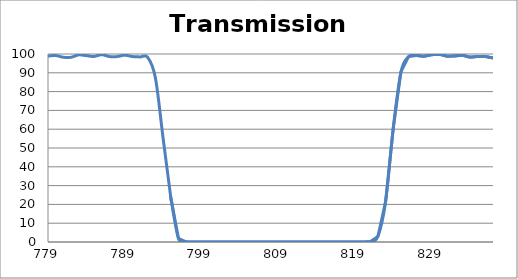
| Category | Transmission (%) |
|---|---|
| 2600.0 | 83.249 |
| 2599.0 | 83.474 |
| 2598.0 | 83.805 |
| 2597.0 | 84.233 |
| 2596.0 | 84.768 |
| 2595.0 | 85.304 |
| 2594.0 | 85.898 |
| 2593.0 | 86.514 |
| 2592.0 | 87.123 |
| 2591.0 | 87.732 |
| 2590.0 | 88.328 |
| 2589.0 | 88.871 |
| 2588.0 | 89.407 |
| 2587.0 | 89.887 |
| 2586.0 | 90.31 |
| 2585.0 | 90.655 |
| 2584.0 | 90.932 |
| 2583.0 | 91.135 |
| 2582.0 | 91.355 |
| 2581.0 | 91.422 |
| 2580.0 | 91.437 |
| 2579.0 | 91.336 |
| 2578.0 | 91.164 |
| 2577.0 | 90.976 |
| 2576.0 | 90.688 |
| 2575.0 | 90.374 |
| 2574.0 | 89.967 |
| 2573.0 | 89.405 |
| 2572.0 | 88.771 |
| 2571.0 | 88.119 |
| 2570.0 | 87.284 |
| 2569.0 | 86.465 |
| 2568.0 | 85.613 |
| 2567.0 | 84.791 |
| 2566.0 | 83.966 |
| 2565.0 | 83.229 |
| 2564.0 | 82.455 |
| 2563.0 | 81.78 |
| 2562.0 | 81.177 |
| 2561.0 | 80.667 |
| 2560.0 | 80.219 |
| 2559.0 | 79.85 |
| 2558.0 | 79.559 |
| 2557.0 | 79.34 |
| 2556.0 | 79.2 |
| 2555.0 | 79.101 |
| 2554.0 | 79.089 |
| 2553.0 | 79.155 |
| 2552.0 | 79.296 |
| 2551.0 | 79.513 |
| 2550.0 | 79.869 |
| 2549.0 | 80.3 |
| 2548.0 | 80.812 |
| 2547.0 | 81.37 |
| 2546.0 | 81.942 |
| 2545.0 | 82.56 |
| 2544.0 | 83.208 |
| 2543.0 | 83.871 |
| 2542.0 | 84.523 |
| 2541.0 | 85.224 |
| 2540.0 | 85.911 |
| 2539.0 | 86.58 |
| 2538.0 | 87.285 |
| 2537.0 | 87.954 |
| 2536.0 | 88.644 |
| 2535.0 | 89.293 |
| 2534.0 | 89.881 |
| 2533.0 | 90.419 |
| 2532.0 | 90.877 |
| 2531.0 | 91.323 |
| 2530.0 | 91.643 |
| 2529.0 | 91.861 |
| 2528.0 | 92.079 |
| 2527.0 | 92.198 |
| 2526.0 | 92.234 |
| 2525.0 | 92.279 |
| 2524.0 | 92.254 |
| 2523.0 | 92.177 |
| 2522.0 | 92.034 |
| 2521.0 | 91.86 |
| 2520.0 | 91.684 |
| 2519.0 | 91.476 |
| 2518.0 | 91.227 |
| 2517.0 | 91.018 |
| 2516.0 | 90.808 |
| 2515.0 | 90.555 |
| 2514.0 | 90.349 |
| 2513.0 | 90.176 |
| 2512.0 | 90.049 |
| 2511.0 | 89.955 |
| 2510.0 | 89.863 |
| 2509.0 | 89.808 |
| 2508.0 | 89.789 |
| 2507.0 | 89.793 |
| 2506.0 | 89.842 |
| 2505.0 | 89.918 |
| 2504.0 | 90.023 |
| 2503.0 | 90.138 |
| 2502.0 | 90.24 |
| 2501.0 | 90.337 |
| 2500.0 | 90.447 |
| 2499.0 | 90.594 |
| 2498.0 | 90.768 |
| 2497.0 | 90.912 |
| 2496.0 | 91.064 |
| 2495.0 | 91.179 |
| 2494.0 | 91.26 |
| 2493.0 | 91.336 |
| 2492.0 | 91.417 |
| 2491.0 | 91.494 |
| 2490.0 | 91.554 |
| 2489.0 | 91.598 |
| 2488.0 | 91.65 |
| 2487.0 | 91.678 |
| 2486.0 | 91.663 |
| 2485.0 | 91.653 |
| 2484.0 | 91.689 |
| 2483.0 | 91.732 |
| 2482.0 | 91.744 |
| 2481.0 | 91.757 |
| 2480.0 | 91.778 |
| 2479.0 | 91.787 |
| 2478.0 | 91.803 |
| 2477.0 | 91.833 |
| 2476.0 | 91.89 |
| 2475.0 | 91.925 |
| 2474.0 | 91.972 |
| 2473.0 | 91.999 |
| 2472.0 | 92.037 |
| 2471.0 | 92.051 |
| 2470.0 | 92.058 |
| 2469.0 | 92.045 |
| 2468.0 | 92.013 |
| 2467.0 | 91.921 |
| 2466.0 | 91.786 |
| 2465.0 | 91.591 |
| 2464.0 | 91.369 |
| 2463.0 | 91.117 |
| 2462.0 | 90.786 |
| 2461.0 | 90.395 |
| 2460.0 | 89.966 |
| 2459.0 | 89.498 |
| 2458.0 | 88.992 |
| 2457.0 | 88.429 |
| 2456.0 | 87.829 |
| 2455.0 | 87.164 |
| 2454.0 | 86.479 |
| 2453.0 | 85.783 |
| 2452.0 | 85.083 |
| 2451.0 | 84.397 |
| 2450.0 | 83.703 |
| 2449.0 | 83.022 |
| 2448.0 | 82.385 |
| 2447.0 | 81.786 |
| 2446.0 | 81.225 |
| 2445.0 | 80.699 |
| 2444.0 | 80.219 |
| 2443.0 | 79.833 |
| 2442.0 | 79.511 |
| 2441.0 | 79.226 |
| 2440.0 | 79.014 |
| 2439.0 | 78.884 |
| 2438.0 | 78.842 |
| 2437.0 | 78.886 |
| 2436.0 | 79.028 |
| 2435.0 | 79.235 |
| 2434.0 | 79.479 |
| 2433.0 | 79.78 |
| 2432.0 | 80.137 |
| 2431.0 | 80.578 |
| 2430.0 | 81.059 |
| 2429.0 | 81.555 |
| 2428.0 | 82.057 |
| 2427.0 | 82.557 |
| 2426.0 | 83.053 |
| 2425.0 | 83.503 |
| 2424.0 | 83.909 |
| 2423.0 | 84.267 |
| 2422.0 | 84.576 |
| 2421.0 | 84.802 |
| 2420.0 | 84.936 |
| 2419.0 | 84.987 |
| 2418.0 | 84.958 |
| 2417.0 | 84.858 |
| 2416.0 | 84.704 |
| 2415.0 | 84.451 |
| 2414.0 | 84.08 |
| 2413.0 | 83.666 |
| 2412.0 | 83.191 |
| 2411.0 | 82.644 |
| 2410.0 | 82.121 |
| 2409.0 | 81.589 |
| 2408.0 | 81.003 |
| 2407.0 | 80.43 |
| 2406.0 | 79.873 |
| 2405.0 | 79.322 |
| 2404.0 | 78.833 |
| 2403.0 | 78.382 |
| 2402.0 | 77.973 |
| 2401.0 | 77.652 |
| 2400.0 | 77.399 |
| 2399.0 | 77.225 |
| 2398.0 | 77.127 |
| 2397.0 | 77.105 |
| 2396.0 | 77.162 |
| 2395.0 | 77.265 |
| 2394.0 | 77.455 |
| 2393.0 | 77.736 |
| 2392.0 | 78.069 |
| 2391.0 | 78.462 |
| 2390.0 | 78.916 |
| 2389.0 | 79.401 |
| 2388.0 | 79.928 |
| 2387.0 | 80.481 |
| 2386.0 | 81.006 |
| 2385.0 | 81.531 |
| 2384.0 | 82.045 |
| 2383.0 | 82.517 |
| 2382.0 | 82.941 |
| 2381.0 | 83.339 |
| 2380.0 | 83.682 |
| 2379.0 | 83.998 |
| 2378.0 | 84.236 |
| 2377.0 | 84.389 |
| 2376.0 | 84.501 |
| 2375.0 | 84.576 |
| 2374.0 | 84.596 |
| 2373.0 | 84.561 |
| 2372.0 | 84.548 |
| 2371.0 | 84.515 |
| 2370.0 | 84.426 |
| 2369.0 | 84.33 |
| 2368.0 | 84.231 |
| 2367.0 | 84.155 |
| 2366.0 | 84.112 |
| 2365.0 | 84.076 |
| 2364.0 | 84.087 |
| 2363.0 | 84.155 |
| 2362.0 | 84.274 |
| 2361.0 | 84.426 |
| 2360.0 | 84.624 |
| 2359.0 | 84.848 |
| 2358.0 | 85.116 |
| 2357.0 | 85.423 |
| 2356.0 | 85.768 |
| 2355.0 | 86.133 |
| 2354.0 | 86.492 |
| 2353.0 | 86.843 |
| 2352.0 | 87.151 |
| 2351.0 | 87.448 |
| 2350.0 | 87.695 |
| 2349.0 | 87.897 |
| 2348.0 | 88.068 |
| 2347.0 | 88.184 |
| 2346.0 | 88.223 |
| 2345.0 | 88.169 |
| 2344.0 | 88.028 |
| 2343.0 | 87.819 |
| 2342.0 | 87.526 |
| 2341.0 | 87.204 |
| 2340.0 | 86.854 |
| 2339.0 | 86.477 |
| 2338.0 | 86.07 |
| 2337.0 | 85.651 |
| 2336.0 | 85.237 |
| 2335.0 | 84.835 |
| 2334.0 | 84.47 |
| 2333.0 | 84.167 |
| 2332.0 | 83.926 |
| 2331.0 | 83.703 |
| 2330.0 | 83.546 |
| 2329.0 | 83.49 |
| 2328.0 | 83.514 |
| 2327.0 | 83.594 |
| 2326.0 | 83.76 |
| 2325.0 | 83.991 |
| 2324.0 | 84.255 |
| 2323.0 | 84.571 |
| 2322.0 | 84.916 |
| 2321.0 | 85.287 |
| 2320.0 | 85.66 |
| 2319.0 | 86.018 |
| 2318.0 | 86.343 |
| 2317.0 | 86.623 |
| 2316.0 | 86.795 |
| 2315.0 | 86.84 |
| 2314.0 | 86.765 |
| 2313.0 | 86.53 |
| 2312.0 | 86.13 |
| 2311.0 | 85.584 |
| 2310.0 | 84.931 |
| 2309.0 | 84.146 |
| 2308.0 | 83.176 |
| 2307.0 | 82.114 |
| 2306.0 | 80.982 |
| 2305.0 | 79.713 |
| 2304.0 | 78.455 |
| 2303.0 | 77.16 |
| 2302.0 | 75.9 |
| 2301.0 | 74.7 |
| 2300.0 | 73.563 |
| 2299.0 | 72.479 |
| 2298.0 | 71.514 |
| 2297.0 | 70.598 |
| 2296.0 | 69.846 |
| 2295.0 | 69.229 |
| 2294.0 | 68.796 |
| 2293.0 | 68.467 |
| 2292.0 | 68.27 |
| 2291.0 | 68.216 |
| 2290.0 | 68.309 |
| 2289.0 | 68.523 |
| 2288.0 | 68.891 |
| 2287.0 | 69.395 |
| 2286.0 | 70.005 |
| 2285.0 | 70.811 |
| 2284.0 | 71.626 |
| 2283.0 | 72.534 |
| 2282.0 | 73.488 |
| 2281.0 | 74.469 |
| 2280.0 | 75.503 |
| 2279.0 | 76.525 |
| 2278.0 | 77.438 |
| 2277.0 | 78.274 |
| 2276.0 | 78.981 |
| 2275.0 | 79.543 |
| 2274.0 | 79.959 |
| 2273.0 | 80.164 |
| 2272.0 | 80.154 |
| 2271.0 | 79.959 |
| 2270.0 | 79.587 |
| 2269.0 | 79.031 |
| 2268.0 | 78.33 |
| 2267.0 | 77.513 |
| 2266.0 | 76.648 |
| 2265.0 | 75.7 |
| 2264.0 | 74.772 |
| 2263.0 | 73.795 |
| 2262.0 | 72.914 |
| 2261.0 | 72.054 |
| 2260.0 | 71.293 |
| 2259.0 | 70.619 |
| 2258.0 | 70.057 |
| 2257.0 | 69.633 |
| 2256.0 | 69.33 |
| 2255.0 | 69.157 |
| 2254.0 | 69.1 |
| 2253.0 | 69.189 |
| 2252.0 | 69.394 |
| 2251.0 | 69.725 |
| 2250.0 | 70.163 |
| 2249.0 | 70.71 |
| 2248.0 | 71.338 |
| 2247.0 | 72.028 |
| 2246.0 | 72.734 |
| 2245.0 | 73.535 |
| 2244.0 | 74.318 |
| 2243.0 | 75.073 |
| 2242.0 | 75.852 |
| 2241.0 | 76.521 |
| 2240.0 | 77.118 |
| 2239.0 | 77.642 |
| 2238.0 | 77.984 |
| 2237.0 | 78.269 |
| 2236.0 | 78.424 |
| 2235.0 | 78.451 |
| 2234.0 | 78.373 |
| 2233.0 | 78.232 |
| 2232.0 | 77.987 |
| 2231.0 | 77.664 |
| 2230.0 | 77.312 |
| 2229.0 | 76.936 |
| 2228.0 | 76.617 |
| 2227.0 | 76.305 |
| 2226.0 | 76.087 |
| 2225.0 | 75.903 |
| 2224.0 | 75.802 |
| 2223.0 | 75.768 |
| 2222.0 | 75.858 |
| 2221.0 | 76.038 |
| 2220.0 | 76.29 |
| 2219.0 | 76.652 |
| 2218.0 | 77.065 |
| 2217.0 | 77.531 |
| 2216.0 | 78.082 |
| 2215.0 | 78.596 |
| 2214.0 | 79.158 |
| 2213.0 | 79.728 |
| 2212.0 | 80.239 |
| 2211.0 | 80.757 |
| 2210.0 | 81.196 |
| 2209.0 | 81.544 |
| 2208.0 | 81.779 |
| 2207.0 | 81.898 |
| 2206.0 | 81.888 |
| 2205.0 | 81.82 |
| 2204.0 | 81.619 |
| 2203.0 | 81.288 |
| 2202.0 | 80.915 |
| 2201.0 | 80.48 |
| 2200.0 | 79.928 |
| 2199.0 | 79.421 |
| 2198.0 | 78.903 |
| 2197.0 | 78.436 |
| 2196.0 | 78 |
| 2195.0 | 77.657 |
| 2194.0 | 77.357 |
| 2193.0 | 77.207 |
| 2192.0 | 77.171 |
| 2191.0 | 77.179 |
| 2190.0 | 77.275 |
| 2189.0 | 77.501 |
| 2188.0 | 77.845 |
| 2187.0 | 78.22 |
| 2186.0 | 78.633 |
| 2185.0 | 79.123 |
| 2184.0 | 79.543 |
| 2183.0 | 79.956 |
| 2182.0 | 80.265 |
| 2181.0 | 80.436 |
| 2180.0 | 80.454 |
| 2179.0 | 80.305 |
| 2178.0 | 80.031 |
| 2177.0 | 79.539 |
| 2176.0 | 78.858 |
| 2175.0 | 78.005 |
| 2174.0 | 77.033 |
| 2173.0 | 75.858 |
| 2172.0 | 74.599 |
| 2171.0 | 73.21 |
| 2170.0 | 71.83 |
| 2169.0 | 70.433 |
| 2168.0 | 69.056 |
| 2167.0 | 67.814 |
| 2166.0 | 66.551 |
| 2165.0 | 65.359 |
| 2164.0 | 64.316 |
| 2163.0 | 63.41 |
| 2162.0 | 62.644 |
| 2161.0 | 62.075 |
| 2160.0 | 61.613 |
| 2159.0 | 61.357 |
| 2158.0 | 61.255 |
| 2157.0 | 61.315 |
| 2156.0 | 61.529 |
| 2155.0 | 61.834 |
| 2154.0 | 62.274 |
| 2153.0 | 62.85 |
| 2152.0 | 63.454 |
| 2151.0 | 64.109 |
| 2150.0 | 64.701 |
| 2149.0 | 65.309 |
| 2148.0 | 65.852 |
| 2147.0 | 66.33 |
| 2146.0 | 66.629 |
| 2145.0 | 66.784 |
| 2144.0 | 66.767 |
| 2143.0 | 66.577 |
| 2142.0 | 66.204 |
| 2141.0 | 65.656 |
| 2140.0 | 64.95 |
| 2139.0 | 64.124 |
| 2138.0 | 63.221 |
| 2137.0 | 62.242 |
| 2136.0 | 61.244 |
| 2135.0 | 60.219 |
| 2134.0 | 59.216 |
| 2133.0 | 58.322 |
| 2132.0 | 57.454 |
| 2131.0 | 56.661 |
| 2130.0 | 55.979 |
| 2129.0 | 55.398 |
| 2128.0 | 54.879 |
| 2127.0 | 54.474 |
| 2126.0 | 54.189 |
| 2125.0 | 54.002 |
| 2124.0 | 53.918 |
| 2123.0 | 53.888 |
| 2122.0 | 53.932 |
| 2121.0 | 54.045 |
| 2120.0 | 54.211 |
| 2119.0 | 54.381 |
| 2118.0 | 54.547 |
| 2117.0 | 54.711 |
| 2116.0 | 54.874 |
| 2115.0 | 55.017 |
| 2114.0 | 55.076 |
| 2113.0 | 55.078 |
| 2112.0 | 55.018 |
| 2111.0 | 54.928 |
| 2110.0 | 54.751 |
| 2109.0 | 54.551 |
| 2108.0 | 54.329 |
| 2107.0 | 54.128 |
| 2106.0 | 53.94 |
| 2105.0 | 53.751 |
| 2104.0 | 53.593 |
| 2103.0 | 53.499 |
| 2102.0 | 53.487 |
| 2101.0 | 53.571 |
| 2100.0 | 53.756 |
| 2099.0 | 54.024 |
| 2098.0 | 54.39 |
| 2097.0 | 54.872 |
| 2096.0 | 55.413 |
| 2095.0 | 56.024 |
| 2094.0 | 56.726 |
| 2093.0 | 57.469 |
| 2092.0 | 58.264 |
| 2091.0 | 59.105 |
| 2090.0 | 59.864 |
| 2089.0 | 60.621 |
| 2088.0 | 61.308 |
| 2087.0 | 61.912 |
| 2086.0 | 62.417 |
| 2085.0 | 62.8 |
| 2084.0 | 62.962 |
| 2083.0 | 62.984 |
| 2082.0 | 62.865 |
| 2081.0 | 62.616 |
| 2080.0 | 62.271 |
| 2079.0 | 61.804 |
| 2078.0 | 61.25 |
| 2077.0 | 60.676 |
| 2076.0 | 60.149 |
| 2075.0 | 59.65 |
| 2074.0 | 59.236 |
| 2073.0 | 58.898 |
| 2072.0 | 58.663 |
| 2071.0 | 58.574 |
| 2070.0 | 58.662 |
| 2069.0 | 58.888 |
| 2068.0 | 59.265 |
| 2067.0 | 59.809 |
| 2066.0 | 60.509 |
| 2065.0 | 61.366 |
| 2064.0 | 62.323 |
| 2063.0 | 63.346 |
| 2062.0 | 64.413 |
| 2061.0 | 65.501 |
| 2060.0 | 66.61 |
| 2059.0 | 67.658 |
| 2058.0 | 68.571 |
| 2057.0 | 69.347 |
| 2056.0 | 69.934 |
| 2055.0 | 70.331 |
| 2054.0 | 70.536 |
| 2053.0 | 70.503 |
| 2052.0 | 70.273 |
| 2051.0 | 69.886 |
| 2050.0 | 69.373 |
| 2049.0 | 68.778 |
| 2048.0 | 68.129 |
| 2047.0 | 67.421 |
| 2046.0 | 66.72 |
| 2045.0 | 66.098 |
| 2044.0 | 65.582 |
| 2043.0 | 65.161 |
| 2042.0 | 64.858 |
| 2041.0 | 64.741 |
| 2040.0 | 64.805 |
| 2039.0 | 65.001 |
| 2038.0 | 65.344 |
| 2037.0 | 65.849 |
| 2036.0 | 66.507 |
| 2035.0 | 67.25 |
| 2034.0 | 68.054 |
| 2033.0 | 68.863 |
| 2032.0 | 69.651 |
| 2031.0 | 70.418 |
| 2030.0 | 71.074 |
| 2029.0 | 71.562 |
| 2028.0 | 71.873 |
| 2027.0 | 71.985 |
| 2026.0 | 71.891 |
| 2025.0 | 71.597 |
| 2024.0 | 71.101 |
| 2023.0 | 70.455 |
| 2022.0 | 69.723 |
| 2021.0 | 68.923 |
| 2020.0 | 68.069 |
| 2019.0 | 67.228 |
| 2018.0 | 66.405 |
| 2017.0 | 65.689 |
| 2016.0 | 65.101 |
| 2015.0 | 64.599 |
| 2014.0 | 64.206 |
| 2013.0 | 63.969 |
| 2012.0 | 63.907 |
| 2011.0 | 63.945 |
| 2010.0 | 64.067 |
| 2009.0 | 64.289 |
| 2008.0 | 64.602 |
| 2007.0 | 64.981 |
| 2006.0 | 65.38 |
| 2005.0 | 65.771 |
| 2004.0 | 66.124 |
| 2003.0 | 66.39 |
| 2002.0 | 66.546 |
| 2001.0 | 66.607 |
| 2000.0 | 66.519 |
| 1999.0 | 66.27 |
| 1998.0 | 65.881 |
| 1997.0 | 65.349 |
| 1996.0 | 64.723 |
| 1995.0 | 64.049 |
| 1994.0 | 63.316 |
| 1993.0 | 62.575 |
| 1992.0 | 61.868 |
| 1991.0 | 61.228 |
| 1990.0 | 60.678 |
| 1989.0 | 60.237 |
| 1988.0 | 59.92 |
| 1987.0 | 59.765 |
| 1986.0 | 59.75 |
| 1985.0 | 59.866 |
| 1984.0 | 60.108 |
| 1983.0 | 60.491 |
| 1982.0 | 60.993 |
| 1981.0 | 61.588 |
| 1980.0 | 62.263 |
| 1979.0 | 62.965 |
| 1978.0 | 63.67 |
| 1977.0 | 64.372 |
| 1976.0 | 65.02 |
| 1975.0 | 65.598 |
| 1974.0 | 66.093 |
| 1973.0 | 66.479 |
| 1972.0 | 66.759 |
| 1971.0 | 66.941 |
| 1970.0 | 67.028 |
| 1969.0 | 67.033 |
| 1968.0 | 66.954 |
| 1967.0 | 66.836 |
| 1966.0 | 66.706 |
| 1965.0 | 66.547 |
| 1964.0 | 66.392 |
| 1963.0 | 66.322 |
| 1962.0 | 66.326 |
| 1961.0 | 66.405 |
| 1960.0 | 66.578 |
| 1959.0 | 66.813 |
| 1958.0 | 67.147 |
| 1957.0 | 67.541 |
| 1956.0 | 68.018 |
| 1955.0 | 68.531 |
| 1954.0 | 69.027 |
| 1953.0 | 69.539 |
| 1952.0 | 70.044 |
| 1951.0 | 70.466 |
| 1950.0 | 70.789 |
| 1949.0 | 71.009 |
| 1948.0 | 71.152 |
| 1947.0 | 71.174 |
| 1946.0 | 71.084 |
| 1945.0 | 70.908 |
| 1944.0 | 70.678 |
| 1943.0 | 70.458 |
| 1942.0 | 70.216 |
| 1941.0 | 69.945 |
| 1940.0 | 69.684 |
| 1939.0 | 69.465 |
| 1938.0 | 69.309 |
| 1937.0 | 69.225 |
| 1936.0 | 69.23 |
| 1935.0 | 69.303 |
| 1934.0 | 69.426 |
| 1933.0 | 69.563 |
| 1932.0 | 69.696 |
| 1931.0 | 69.924 |
| 1930.0 | 70.042 |
| 1929.0 | 70.085 |
| 1928.0 | 70.131 |
| 1927.0 | 70.096 |
| 1926.0 | 69.947 |
| 1925.0 | 69.694 |
| 1924.0 | 69.388 |
| 1923.0 | 68.986 |
| 1922.0 | 68.415 |
| 1921.0 | 67.743 |
| 1920.0 | 67.097 |
| 1919.0 | 66.434 |
| 1918.0 | 65.832 |
| 1917.0 | 65.408 |
| 1916.0 | 65.037 |
| 1915.0 | 64.698 |
| 1914.0 | 64.374 |
| 1913.0 | 64.11 |
| 1912.0 | 63.996 |
| 1911.0 | 63.995 |
| 1910.0 | 64.123 |
| 1909.0 | 64.347 |
| 1908.0 | 64.591 |
| 1907.0 | 64.829 |
| 1906.0 | 65.067 |
| 1905.0 | 65.213 |
| 1904.0 | 65.305 |
| 1903.0 | 65.37 |
| 1902.0 | 65.399 |
| 1901.0 | 65.263 |
| 1900.0 | 64.995 |
| 1899.0 | 64.59 |
| 1898.0 | 64.083 |
| 1897.0 | 63.656 |
| 1896.0 | 63.271 |
| 1895.0 | 62.801 |
| 1894.0 | 62.384 |
| 1893.0 | 61.929 |
| 1892.0 | 61.418 |
| 1891.0 | 61.011 |
| 1890.0 | 60.722 |
| 1889.0 | 60.571 |
| 1888.0 | 60.659 |
| 1887.0 | 60.813 |
| 1886.0 | 61.084 |
| 1885.0 | 61.467 |
| 1884.0 | 61.934 |
| 1883.0 | 62.49 |
| 1882.0 | 63.081 |
| 1881.0 | 63.796 |
| 1880.0 | 64.547 |
| 1879.0 | 65.26 |
| 1878.0 | 65.977 |
| 1877.0 | 66.532 |
| 1876.0 | 67.002 |
| 1875.0 | 67.437 |
| 1874.0 | 67.775 |
| 1873.0 | 67.925 |
| 1872.0 | 68.081 |
| 1871.0 | 68.161 |
| 1870.0 | 68.192 |
| 1869.0 | 68.178 |
| 1868.0 | 68.202 |
| 1867.0 | 68.147 |
| 1866.0 | 68.214 |
| 1865.0 | 68.241 |
| 1864.0 | 68.259 |
| 1863.0 | 68.309 |
| 1862.0 | 68.328 |
| 1861.0 | 68.252 |
| 1860.0 | 68.213 |
| 1859.0 | 68.133 |
| 1858.0 | 68.037 |
| 1857.0 | 68.001 |
| 1856.0 | 67.958 |
| 1855.0 | 67.878 |
| 1854.0 | 67.724 |
| 1853.0 | 67.516 |
| 1852.0 | 67.318 |
| 1851.0 | 67.204 |
| 1850.0 | 67.13 |
| 1849.0 | 67.065 |
| 1848.0 | 66.965 |
| 1847.0 | 66.722 |
| 1846.0 | 66.746 |
| 1845.0 | 66.655 |
| 1844.0 | 66.873 |
| 1843.0 | 67.127 |
| 1842.0 | 67.297 |
| 1841.0 | 67.256 |
| 1840.0 | 67.171 |
| 1839.0 | 67.189 |
| 1838.0 | 67.072 |
| 1837.0 | 66.866 |
| 1836.0 | 66.585 |
| 1835.0 | 66.172 |
| 1834.0 | 65.758 |
| 1833.0 | 65.332 |
| 1832.0 | 64.832 |
| 1831.0 | 64.188 |
| 1830.0 | 63.442 |
| 1829.0 | 62.856 |
| 1828.0 | 62.355 |
| 1827.0 | 61.861 |
| 1826.0 | 61.452 |
| 1825.0 | 61.223 |
| 1824.0 | 61.137 |
| 1823.0 | 61.194 |
| 1822.0 | 61.27 |
| 1821.0 | 61.267 |
| 1820.0 | 61.205 |
| 1819.0 | 61.309 |
| 1818.0 | 61.395 |
| 1817.0 | 61.541 |
| 1816.0 | 61.554 |
| 1815.0 | 61.42 |
| 1814.0 | 61.141 |
| 1813.0 | 60.786 |
| 1812.0 | 60.249 |
| 1811.0 | 59.617 |
| 1810.0 | 58.944 |
| 1809.0 | 58.303 |
| 1808.0 | 57.673 |
| 1807.0 | 57.055 |
| 1806.0 | 56.429 |
| 1805.0 | 55.85 |
| 1804.0 | 55.429 |
| 1803.0 | 55.118 |
| 1802.0 | 55.003 |
| 1801.0 | 54.981 |
| 1800.0 | 55.069 |
| 1799.0 | 55.275 |
| 1798.0 | 55.598 |
| 1797.0 | 55.994 |
| 1796.0 | 56.356 |
| 1795.0 | 56.716 |
| 1794.0 | 57.027 |
| 1793.0 | 57.246 |
| 1792.0 | 57.394 |
| 1791.0 | 57.432 |
| 1790.0 | 57.374 |
| 1789.0 | 57.225 |
| 1788.0 | 57.032 |
| 1787.0 | 56.83 |
| 1786.0 | 56.628 |
| 1785.0 | 56.441 |
| 1784.0 | 56.334 |
| 1783.0 | 56.381 |
| 1782.0 | 56.512 |
| 1781.0 | 56.777 |
| 1780.0 | 57.158 |
| 1779.0 | 57.686 |
| 1778.0 | 58.274 |
| 1777.0 | 58.909 |
| 1776.0 | 59.587 |
| 1775.0 | 60.25 |
| 1774.0 | 60.842 |
| 1773.0 | 61.345 |
| 1772.0 | 61.732 |
| 1771.0 | 61.997 |
| 1770.0 | 62.123 |
| 1769.0 | 62.105 |
| 1768.0 | 61.979 |
| 1767.0 | 61.795 |
| 1766.0 | 61.583 |
| 1765.0 | 61.402 |
| 1764.0 | 61.302 |
| 1763.0 | 61.303 |
| 1762.0 | 61.412 |
| 1761.0 | 61.664 |
| 1760.0 | 62.069 |
| 1759.0 | 62.602 |
| 1758.0 | 63.197 |
| 1757.0 | 63.804 |
| 1756.0 | 64.353 |
| 1755.0 | 64.79 |
| 1754.0 | 65.035 |
| 1753.0 | 65.004 |
| 1752.0 | 64.694 |
| 1751.0 | 64.103 |
| 1750.0 | 63.201 |
| 1749.0 | 62.122 |
| 1748.0 | 60.922 |
| 1747.0 | 59.67 |
| 1746.0 | 58.465 |
| 1745.0 | 57.425 |
| 1744.0 | 56.573 |
| 1743.0 | 55.968 |
| 1742.0 | 55.634 |
| 1741.0 | 55.629 |
| 1740.0 | 55.879 |
| 1739.0 | 56.36 |
| 1738.0 | 57.062 |
| 1737.0 | 57.93 |
| 1736.0 | 58.853 |
| 1735.0 | 59.746 |
| 1734.0 | 60.502 |
| 1733.0 | 61.019 |
| 1732.0 | 61.202 |
| 1731.0 | 60.996 |
| 1730.0 | 60.382 |
| 1729.0 | 59.385 |
| 1728.0 | 58.072 |
| 1727.0 | 56.499 |
| 1726.0 | 54.842 |
| 1725.0 | 53.216 |
| 1724.0 | 51.716 |
| 1723.0 | 50.41 |
| 1722.0 | 49.279 |
| 1721.0 | 48.463 |
| 1720.0 | 47.953 |
| 1719.0 | 47.75 |
| 1718.0 | 47.842 |
| 1717.0 | 48.198 |
| 1716.0 | 48.79 |
| 1715.0 | 49.564 |
| 1714.0 | 50.437 |
| 1713.0 | 51.29 |
| 1712.0 | 52.086 |
| 1711.0 | 52.718 |
| 1710.0 | 53.123 |
| 1709.0 | 53.27 |
| 1708.0 | 53.169 |
| 1707.0 | 52.86 |
| 1706.0 | 52.392 |
| 1705.0 | 51.863 |
| 1704.0 | 51.34 |
| 1703.0 | 50.913 |
| 1702.0 | 50.642 |
| 1701.0 | 50.581 |
| 1700.0 | 50.768 |
| 1699.0 | 51.22 |
| 1698.0 | 51.946 |
| 1697.0 | 52.836 |
| 1696.0 | 53.944 |
| 1695.0 | 55.206 |
| 1694.0 | 56.551 |
| 1693.0 | 57.914 |
| 1692.0 | 59.209 |
| 1691.0 | 60.341 |
| 1690.0 | 61.268 |
| 1689.0 | 61.953 |
| 1688.0 | 62.372 |
| 1687.0 | 62.546 |
| 1686.0 | 62.55 |
| 1685.0 | 62.418 |
| 1684.0 | 62.225 |
| 1683.0 | 62.032 |
| 1682.0 | 61.905 |
| 1681.0 | 61.889 |
| 1680.0 | 61.981 |
| 1679.0 | 62.181 |
| 1678.0 | 62.469 |
| 1677.0 | 62.779 |
| 1676.0 | 63.013 |
| 1675.0 | 63.07 |
| 1674.0 | 62.93 |
| 1673.0 | 62.512 |
| 1672.0 | 61.803 |
| 1671.0 | 60.834 |
| 1670.0 | 59.627 |
| 1669.0 | 58.209 |
| 1668.0 | 56.73 |
| 1667.0 | 55.29 |
| 1666.0 | 53.816 |
| 1665.0 | 52.448 |
| 1664.0 | 51.177 |
| 1663.0 | 50.021 |
| 1662.0 | 48.987 |
| 1661.0 | 48.082 |
| 1660.0 | 47.263 |
| 1659.0 | 46.467 |
| 1658.0 | 45.712 |
| 1657.0 | 45.027 |
| 1656.0 | 44.38 |
| 1655.0 | 43.773 |
| 1654.0 | 43.229 |
| 1653.0 | 42.754 |
| 1652.0 | 42.393 |
| 1651.0 | 42.162 |
| 1650.0 | 42.049 |
| 1649.0 | 42.089 |
| 1648.0 | 42.293 |
| 1647.0 | 42.643 |
| 1646.0 | 43.109 |
| 1645.0 | 43.674 |
| 1644.0 | 44.237 |
| 1643.0 | 44.677 |
| 1642.0 | 44.95 |
| 1641.0 | 44.972 |
| 1640.0 | 44.679 |
| 1639.0 | 44.036 |
| 1638.0 | 43.072 |
| 1637.0 | 41.889 |
| 1636.0 | 40.555 |
| 1635.0 | 39.172 |
| 1634.0 | 37.901 |
| 1633.0 | 36.794 |
| 1632.0 | 35.96 |
| 1631.0 | 35.476 |
| 1630.0 | 35.324 |
| 1629.0 | 35.544 |
| 1628.0 | 36.149 |
| 1627.0 | 37.163 |
| 1626.0 | 38.533 |
| 1625.0 | 40.255 |
| 1624.0 | 42.205 |
| 1623.0 | 44.16 |
| 1622.0 | 46.039 |
| 1621.0 | 47.577 |
| 1620.0 | 48.573 |
| 1619.0 | 48.999 |
| 1618.0 | 48.838 |
| 1617.0 | 48.159 |
| 1616.0 | 47.105 |
| 1615.0 | 45.889 |
| 1614.0 | 44.732 |
| 1613.0 | 43.737 |
| 1612.0 | 43.048 |
| 1611.0 | 42.771 |
| 1610.0 | 42.961 |
| 1609.0 | 43.649 |
| 1608.0 | 44.836 |
| 1607.0 | 46.525 |
| 1606.0 | 48.629 |
| 1605.0 | 51.028 |
| 1604.0 | 53.58 |
| 1603.0 | 56.047 |
| 1602.0 | 58.151 |
| 1601.0 | 59.694 |
| 1600.0 | 60.516 |
| 1599.0 | 60.568 |
| 1598.0 | 60.015 |
| 1597.0 | 59.11 |
| 1596.0 | 58.105 |
| 1595.0 | 57.221 |
| 1594.0 | 56.678 |
| 1593.0 | 56.58 |
| 1592.0 | 56.936 |
| 1591.0 | 57.752 |
| 1590.0 | 58.948 |
| 1589.0 | 60.325 |
| 1588.0 | 61.648 |
| 1587.0 | 62.708 |
| 1586.0 | 63.255 |
| 1585.0 | 63.102 |
| 1584.0 | 62.25 |
| 1583.0 | 60.869 |
| 1582.0 | 59.099 |
| 1581.0 | 57.254 |
| 1580.0 | 55.519 |
| 1579.0 | 54.052 |
| 1578.0 | 52.986 |
| 1577.0 | 52.41 |
| 1576.0 | 52.36 |
| 1575.0 | 52.792 |
| 1574.0 | 53.612 |
| 1573.0 | 54.71 |
| 1572.0 | 55.843 |
| 1571.0 | 56.793 |
| 1570.0 | 57.322 |
| 1569.0 | 57.295 |
| 1568.0 | 56.58 |
| 1567.0 | 55.181 |
| 1566.0 | 53.302 |
| 1565.0 | 51.202 |
| 1564.0 | 49.046 |
| 1563.0 | 47.049 |
| 1562.0 | 45.513 |
| 1561.0 | 44.417 |
| 1560.0 | 43.857 |
| 1559.0 | 43.864 |
| 1558.0 | 44.389 |
| 1557.0 | 45.409 |
| 1556.0 | 46.7 |
| 1555.0 | 48.134 |
| 1554.0 | 49.494 |
| 1553.0 | 50.604 |
| 1552.0 | 51.233 |
| 1551.0 | 51.311 |
| 1550.0 | 50.867 |
| 1549.0 | 50.022 |
| 1548.0 | 48.985 |
| 1547.0 | 48.025 |
| 1546.0 | 47.302 |
| 1545.0 | 46.969 |
| 1544.0 | 47.132 |
| 1543.0 | 47.868 |
| 1542.0 | 49.15 |
| 1541.0 | 50.951 |
| 1540.0 | 53.094 |
| 1539.0 | 55.484 |
| 1538.0 | 57.776 |
| 1537.0 | 59.631 |
| 1536.0 | 60.964 |
| 1535.0 | 61.417 |
| 1534.0 | 61.047 |
| 1533.0 | 60.041 |
| 1532.0 | 58.673 |
| 1531.0 | 57.205 |
| 1530.0 | 55.913 |
| 1529.0 | 54.936 |
| 1528.0 | 54.463 |
| 1527.0 | 54.47 |
| 1526.0 | 55.019 |
| 1525.0 | 55.903 |
| 1524.0 | 56.96 |
| 1523.0 | 57.97 |
| 1522.0 | 58.627 |
| 1521.0 | 58.711 |
| 1520.0 | 58.123 |
| 1519.0 | 56.863 |
| 1518.0 | 55.076 |
| 1517.0 | 53.189 |
| 1516.0 | 51.273 |
| 1515.0 | 49.629 |
| 1514.0 | 48.474 |
| 1513.0 | 47.782 |
| 1512.0 | 47.647 |
| 1511.0 | 47.956 |
| 1510.0 | 48.618 |
| 1509.0 | 49.4 |
| 1508.0 | 50.085 |
| 1507.0 | 50.434 |
| 1506.0 | 50.288 |
| 1505.0 | 49.597 |
| 1504.0 | 48.346 |
| 1503.0 | 46.763 |
| 1502.0 | 45.012 |
| 1501.0 | 43.36 |
| 1500.0 | 42.012 |
| 1499.0 | 41.003 |
| 1498.0 | 40.494 |
| 1497.0 | 40.385 |
| 1496.0 | 40.717 |
| 1495.0 | 41.414 |
| 1494.0 | 42.373 |
| 1493.0 | 43.465 |
| 1492.0 | 44.472 |
| 1491.0 | 45.294 |
| 1490.0 | 45.729 |
| 1489.0 | 45.783 |
| 1488.0 | 45.459 |
| 1487.0 | 44.849 |
| 1486.0 | 44.159 |
| 1485.0 | 43.521 |
| 1484.0 | 43.121 |
| 1483.0 | 43.125 |
| 1482.0 | 43.523 |
| 1481.0 | 44.403 |
| 1480.0 | 45.668 |
| 1479.0 | 47.275 |
| 1478.0 | 49.003 |
| 1477.0 | 50.733 |
| 1476.0 | 52.248 |
| 1475.0 | 53.342 |
| 1474.0 | 54.049 |
| 1473.0 | 54.372 |
| 1472.0 | 54.502 |
| 1471.0 | 54.589 |
| 1470.0 | 54.85 |
| 1469.0 | 55.465 |
| 1468.0 | 56.416 |
| 1467.0 | 57.815 |
| 1466.0 | 59.291 |
| 1465.0 | 60.789 |
| 1464.0 | 62.019 |
| 1463.0 | 62.722 |
| 1462.0 | 62.84 |
| 1461.0 | 62.312 |
| 1460.0 | 61.348 |
| 1459.0 | 60.221 |
| 1458.0 | 59.149 |
| 1457.0 | 58.504 |
| 1456.0 | 58.364 |
| 1455.0 | 58.849 |
| 1454.0 | 59.806 |
| 1453.0 | 61.179 |
| 1452.0 | 62.642 |
| 1451.0 | 63.771 |
| 1450.0 | 64.153 |
| 1449.0 | 63.469 |
| 1448.0 | 61.653 |
| 1447.0 | 58.85 |
| 1446.0 | 55.751 |
| 1445.0 | 52.549 |
| 1444.0 | 49.696 |
| 1443.0 | 47.683 |
| 1442.0 | 46.426 |
| 1441.0 | 45.975 |
| 1440.0 | 46.261 |
| 1439.0 | 47.19 |
| 1438.0 | 48.19 |
| 1437.0 | 48.963 |
| 1436.0 | 49.018 |
| 1435.0 | 48.032 |
| 1434.0 | 46.059 |
| 1433.0 | 43.239 |
| 1432.0 | 40.225 |
| 1431.0 | 37.305 |
| 1430.0 | 34.94 |
| 1429.0 | 33.327 |
| 1428.0 | 32.457 |
| 1427.0 | 32.421 |
| 1426.0 | 33.237 |
| 1425.0 | 34.948 |
| 1424.0 | 37.5 |
| 1423.0 | 40.612 |
| 1422.0 | 43.843 |
| 1421.0 | 46.794 |
| 1420.0 | 48.858 |
| 1419.0 | 49.375 |
| 1418.0 | 48.468 |
| 1417.0 | 46.574 |
| 1416.0 | 44.316 |
| 1415.0 | 42.214 |
| 1414.0 | 40.395 |
| 1413.0 | 39.337 |
| 1412.0 | 39.304 |
| 1411.0 | 40.197 |
| 1410.0 | 42.137 |
| 1409.0 | 44.996 |
| 1408.0 | 48.432 |
| 1407.0 | 52.338 |
| 1406.0 | 55.959 |
| 1405.0 | 59.209 |
| 1404.0 | 61.482 |
| 1403.0 | 62.309 |
| 1402.0 | 62.021 |
| 1401.0 | 60.874 |
| 1400.0 | 59.355 |
| 1399.0 | 58.075 |
| 1398.0 | 57.46 |
| 1397.0 | 57.641 |
| 1396.0 | 58.496 |
| 1395.0 | 59.694 |
| 1394.0 | 61.066 |
| 1393.0 | 62.85 |
| 1392.0 | 64.946 |
| 1391.0 | 66.897 |
| 1390.0 | 68.456 |
| 1389.0 | 69.846 |
| 1388.0 | 70.753 |
| 1387.0 | 70.842 |
| 1386.0 | 70.115 |
| 1385.0 | 68.541 |
| 1384.0 | 66.051 |
| 1383.0 | 62.618 |
| 1382.0 | 58.855 |
| 1381.0 | 55.441 |
| 1380.0 | 52.858 |
| 1379.0 | 51.138 |
| 1378.0 | 50.38 |
| 1377.0 | 50.651 |
| 1376.0 | 51.902 |
| 1375.0 | 54.047 |
| 1374.0 | 56.862 |
| 1373.0 | 59.844 |
| 1372.0 | 62.136 |
| 1371.0 | 62.723 |
| 1370.0 | 60.986 |
| 1369.0 | 57.523 |
| 1368.0 | 52.876 |
| 1367.0 | 47.917 |
| 1366.0 | 44.016 |
| 1365.0 | 41.232 |
| 1364.0 | 39.557 |
| 1363.0 | 39.351 |
| 1362.0 | 40.873 |
| 1361.0 | 43.852 |
| 1360.0 | 48.018 |
| 1359.0 | 53.18 |
| 1358.0 | 58.374 |
| 1357.0 | 62.202 |
| 1356.0 | 63.227 |
| 1355.0 | 61.049 |
| 1354.0 | 56.837 |
| 1353.0 | 52.395 |
| 1352.0 | 48.651 |
| 1351.0 | 46.367 |
| 1350.0 | 45.852 |
| 1349.0 | 47.108 |
| 1348.0 | 50.123 |
| 1347.0 | 54.914 |
| 1346.0 | 60.968 |
| 1345.0 | 67.421 |
| 1344.0 | 72.57 |
| 1343.0 | 74.994 |
| 1342.0 | 74.661 |
| 1341.0 | 72.222 |
| 1340.0 | 69.225 |
| 1339.0 | 66.726 |
| 1338.0 | 65.65 |
| 1337.0 | 66.348 |
| 1336.0 | 68.7 |
| 1335.0 | 72.02 |
| 1334.0 | 75.289 |
| 1333.0 | 77.061 |
| 1332.0 | 76.054 |
| 1331.0 | 72.082 |
| 1330.0 | 66.113 |
| 1329.0 | 59.803 |
| 1328.0 | 54.35 |
| 1327.0 | 50.427 |
| 1326.0 | 48.418 |
| 1325.0 | 48.308 |
| 1324.0 | 50.125 |
| 1323.0 | 53.654 |
| 1322.0 | 58.52 |
| 1321.0 | 63.649 |
| 1320.0 | 67.159 |
| 1319.0 | 67.681 |
| 1318.0 | 64.797 |
| 1317.0 | 59.693 |
| 1316.0 | 54.035 |
| 1315.0 | 49.291 |
| 1314.0 | 46.076 |
| 1313.0 | 44.52 |
| 1312.0 | 44.858 |
| 1311.0 | 46.794 |
| 1310.0 | 50.254 |
| 1309.0 | 54.99 |
| 1308.0 | 60.351 |
| 1307.0 | 65.226 |
| 1306.0 | 68.808 |
| 1305.0 | 70.571 |
| 1304.0 | 70.636 |
| 1303.0 | 69.807 |
| 1302.0 | 68.938 |
| 1301.0 | 68.678 |
| 1300.0 | 69.353 |
| 1299.0 | 71.018 |
| 1298.0 | 73.415 |
| 1297.0 | 76.158 |
| 1296.0 | 78.768 |
| 1295.0 | 80.827 |
| 1294.0 | 82.131 |
| 1293.0 | 82.704 |
| 1292.0 | 82.819 |
| 1291.0 | 82.691 |
| 1290.0 | 82.47 |
| 1289.0 | 82.064 |
| 1288.0 | 81.156 |
| 1287.0 | 79.502 |
| 1286.0 | 76.956 |
| 1285.0 | 73.626 |
| 1284.0 | 70.004 |
| 1283.0 | 66.693 |
| 1282.0 | 64.199 |
| 1281.0 | 62.983 |
| 1280.0 | 63.315 |
| 1279.0 | 65.21 |
| 1278.0 | 68.394 |
| 1277.0 | 72.454 |
| 1276.0 | 76.284 |
| 1275.0 | 78.57 |
| 1274.0 | 78.687 |
| 1273.0 | 76.525 |
| 1272.0 | 72.817 |
| 1271.0 | 68.691 |
| 1270.0 | 65.243 |
| 1269.0 | 63.158 |
| 1268.0 | 62.757 |
| 1267.0 | 64.033 |
| 1266.0 | 66.779 |
| 1265.0 | 70.628 |
| 1264.0 | 74.882 |
| 1263.0 | 78.719 |
| 1262.0 | 81.418 |
| 1261.0 | 82.569 |
| 1260.0 | 82.274 |
| 1259.0 | 81.155 |
| 1258.0 | 79.871 |
| 1257.0 | 78.914 |
| 1256.0 | 78.647 |
| 1255.0 | 79.13 |
| 1254.0 | 80.145 |
| 1253.0 | 81.405 |
| 1252.0 | 82.612 |
| 1251.0 | 83.583 |
| 1250.0 | 84.206 |
| 1249.0 | 84.553 |
| 1248.0 | 84.837 |
| 1247.0 | 85.177 |
| 1246.0 | 85.671 |
| 1245.0 | 86.282 |
| 1244.0 | 86.787 |
| 1243.0 | 86.974 |
| 1242.0 | 86.647 |
| 1241.0 | 85.79 |
| 1240.0 | 84.55 |
| 1239.0 | 83.287 |
| 1238.0 | 82.384 |
| 1237.0 | 82.088 |
| 1236.0 | 82.564 |
| 1235.0 | 83.738 |
| 1234.0 | 85.409 |
| 1233.0 | 87.119 |
| 1232.0 | 88.363 |
| 1231.0 | 88.776 |
| 1230.0 | 88.178 |
| 1229.0 | 86.812 |
| 1228.0 | 85.097 |
| 1227.0 | 83.575 |
| 1226.0 | 82.66 |
| 1225.0 | 82.532 |
| 1224.0 | 83.24 |
| 1223.0 | 84.589 |
| 1222.0 | 86.158 |
| 1221.0 | 87.521 |
| 1220.0 | 88.292 |
| 1219.0 | 88.273 |
| 1218.0 | 87.482 |
| 1217.0 | 86.285 |
| 1216.0 | 85.102 |
| 1215.0 | 84.299 |
| 1214.0 | 84.142 |
| 1213.0 | 84.663 |
| 1212.0 | 85.696 |
| 1211.0 | 86.957 |
| 1210.0 | 88.007 |
| 1209.0 | 88.499 |
| 1208.0 | 88.276 |
| 1207.0 | 87.467 |
| 1206.0 | 86.385 |
| 1205.0 | 85.42 |
| 1204.0 | 85.018 |
| 1203.0 | 85.37 |
| 1202.0 | 86.321 |
| 1201.0 | 87.594 |
| 1200.0 | 88.848 |
| 1199.0 | 89.619 |
| 1198.0 | 89.61 |
| 1197.0 | 89.012 |
| 1196.0 | 88.176 |
| 1195.0 | 87.567 |
| 1194.0 | 87.535 |
| 1193.0 | 88.164 |
| 1192.0 | 89.326 |
| 1191.0 | 90.639 |
| 1190.0 | 91.558 |
| 1189.0 | 91.731 |
| 1188.0 | 91.198 |
| 1187.0 | 90.272 |
| 1186.0 | 89.428 |
| 1185.0 | 89.108 |
| 1184.0 | 89.527 |
| 1183.0 | 90.6 |
| 1182.0 | 91.968 |
| 1181.0 | 93.1 |
| 1180.0 | 93.545 |
| 1179.0 | 93.128 |
| 1178.0 | 92.048 |
| 1177.0 | 90.77 |
| 1176.0 | 89.844 |
| 1175.0 | 89.612 |
| 1174.0 | 90.22 |
| 1173.0 | 91.421 |
| 1172.0 | 92.814 |
| 1171.0 | 93.857 |
| 1170.0 | 94.137 |
| 1169.0 | 93.639 |
| 1168.0 | 92.668 |
| 1167.0 | 91.71 |
| 1166.0 | 91.196 |
| 1165.0 | 91.459 |
| 1164.0 | 92.343 |
| 1163.0 | 93.549 |
| 1162.0 | 94.575 |
| 1161.0 | 95.059 |
| 1160.0 | 94.896 |
| 1159.0 | 94.367 |
| 1158.0 | 93.849 |
| 1157.0 | 93.698 |
| 1156.0 | 93.999 |
| 1155.0 | 94.496 |
| 1154.0 | 94.78 |
| 1153.0 | 94.549 |
| 1152.0 | 93.717 |
| 1151.0 | 92.629 |
| 1150.0 | 91.796 |
| 1149.0 | 91.655 |
| 1148.0 | 92.397 |
| 1147.0 | 93.849 |
| 1146.0 | 95.27 |
| 1145.0 | 96.185 |
| 1144.0 | 96.103 |
| 1143.0 | 95.067 |
| 1142.0 | 93.57 |
| 1141.0 | 92.356 |
| 1140.0 | 91.999 |
| 1139.0 | 92.675 |
| 1138.0 | 94.079 |
| 1137.0 | 95.667 |
| 1136.0 | 96.67 |
| 1135.0 | 96.532 |
| 1134.0 | 95.401 |
| 1133.0 | 93.889 |
| 1132.0 | 92.552 |
| 1131.0 | 92.157 |
| 1130.0 | 92.814 |
| 1129.0 | 94.316 |
| 1128.0 | 96.111 |
| 1127.0 | 97.107 |
| 1126.0 | 97.085 |
| 1125.0 | 95.96 |
| 1124.0 | 94.485 |
| 1123.0 | 93.439 |
| 1122.0 | 93.367 |
| 1121.0 | 94.364 |
| 1120.0 | 95.973 |
| 1119.0 | 97.256 |
| 1118.0 | 97.462 |
| 1117.0 | 96.24 |
| 1116.0 | 94.112 |
| 1115.0 | 92.029 |
| 1114.0 | 90.917 |
| 1113.0 | 91.144 |
| 1112.0 | 92.66 |
| 1111.0 | 94.891 |
| 1110.0 | 96.906 |
| 1109.0 | 97.932 |
| 1108.0 | 97.708 |
| 1107.0 | 96.585 |
| 1106.0 | 95.282 |
| 1105.0 | 94.455 |
| 1104.0 | 94.405 |
| 1103.0 | 95.093 |
| 1102.0 | 96.177 |
| 1101.0 | 97.221 |
| 1100.0 | 97.867 |
| 1099.0 | 98.099 |
| 1098.0 | 98.007 |
| 1097.0 | 97.845 |
| 1096.0 | 97.915 |
| 1095.0 | 98.139 |
| 1094.0 | 98.503 |
| 1093.0 | 98.839 |
| 1092.0 | 99.048 |
| 1091.0 | 99.081 |
| 1090.0 | 99.01 |
| 1089.0 | 98.913 |
| 1088.0 | 98.869 |
| 1087.0 | 98.943 |
| 1086.0 | 99.05 |
| 1085.0 | 99.138 |
| 1084.0 | 99.239 |
| 1083.0 | 99.28 |
| 1082.0 | 99.272 |
| 1081.0 | 99.302 |
| 1080.0 | 99.39 |
| 1079.0 | 99.441 |
| 1078.0 | 99.481 |
| 1077.0 | 99.519 |
| 1076.0 | 99.517 |
| 1075.0 | 99.531 |
| 1074.0 | 99.541 |
| 1073.0 | 99.522 |
| 1072.0 | 99.526 |
| 1071.0 | 99.462 |
| 1070.0 | 99.411 |
| 1069.0 | 99.389 |
| 1068.0 | 99.443 |
| 1067.0 | 99.524 |
| 1066.0 | 99.607 |
| 1065.0 | 99.676 |
| 1064.0 | 99.681 |
| 1063.0 | 99.716 |
| 1062.0 | 99.707 |
| 1061.0 | 99.748 |
| 1060.0 | 98.916 |
| 1059.0 | 98.91 |
| 1058.0 | 98.921 |
| 1057.0 | 98.024 |
| 1056.0 | 97.914 |
| 1055.0 | 98.637 |
| 1054.0 | 98.763 |
| 1053.0 | 98.259 |
| 1052.0 | 98.68 |
| 1051.0 | 98.437 |
| 1050.0 | 98.332 |
| 1049.0 | 98.781 |
| 1048.0 | 97.935 |
| 1047.0 | 97.924 |
| 1046.0 | 98.663 |
| 1045.0 | 98.678 |
| 1044.0 | 98.345 |
| 1043.0 | 99.315 |
| 1042.0 | 98.956 |
| 1041.0 | 98.847 |
| 1040.0 | 99.856 |
| 1039.0 | 99.614 |
| 1038.0 | 98.816 |
| 1037.0 | 99.181 |
| 1036.0 | 98.579 |
| 1035.0 | 98.91 |
| 1034.0 | 98.904 |
| 1033.0 | 98.915 |
| 1032.0 | 98.018 |
| 1031.0 | 97.908 |
| 1030.0 | 98.632 |
| 1029.0 | 98.758 |
| 1028.0 | 98.254 |
| 1027.0 | 98.674 |
| 1026.0 | 98.432 |
| 1025.0 | 98.327 |
| 1024.0 | 98.776 |
| 1023.0 | 98.511 |
| 1022.0 | 98.5 |
| 1021.0 | 98.739 |
| 1020.0 | 98.566 |
| 1019.0 | 98.234 |
| 1018.0 | 99.203 |
| 1017.0 | 98.844 |
| 1016.0 | 98.735 |
| 1015.0 | 99.744 |
| 1014.0 | 99.502 |
| 1013.0 | 98.704 |
| 1012.0 | 99.069 |
| 1011.0 | 98.467 |
| 1010.0 | 98.91 |
| 1009.0 | 98.904 |
| 1008.0 | 98.915 |
| 1007.0 | 98.018 |
| 1006.0 | 99.31 |
| 1005.0 | 98.632 |
| 1004.0 | 98.758 |
| 1003.0 | 98.254 |
| 1002.0 | 98.674 |
| 1001.0 | 98.432 |
| 1000.0 | 98.327 |
| 999.0 | 98.776 |
| 998.0 | 97.929 |
| 997.0 | 97.918 |
| 996.0 | 98.657 |
| 995.0 | 98.445 |
| 994.0 | 98.113 |
| 993.0 | 99.082 |
| 992.0 | 98.723 |
| 991.0 | 98.614 |
| 990.0 | 99.345 |
| 989.0 | 99.103 |
| 988.0 | 98.591 |
| 987.0 | 98.956 |
| 986.0 | 98.354 |
| 985.0 | 98.626 |
| 984.0 | 98.621 |
| 983.0 | 98.631 |
| 982.0 | 97.735 |
| 981.0 | 97.903 |
| 980.0 | 98.626 |
| 979.0 | 98.752 |
| 978.0 | 98.248 |
| 977.0 | 98.668 |
| 976.0 | 98.426 |
| 975.0 | 98.321 |
| 974.0 | 98.77 |
| 973.0 | 98.505 |
| 972.0 | 98.494 |
| 971.0 | 98.733 |
| 970.0 | 98.56 |
| 969.0 | 98.228 |
| 968.0 | 99.197 |
| 967.0 | 98.838 |
| 966.0 | 98.729 |
| 965.0 | 99.438 |
| 964.0 | 99.196 |
| 963.0 | 98.398 |
| 962.0 | 98.764 |
| 961.0 | 98.161 |
| 960.0 | 98.721 |
| 959.0 | 98.97 |
| 958.0 | 98.98 |
| 957.0 | 97.966 |
| 956.0 | 97.719 |
| 955.0 | 98.697 |
| 954.0 | 98.823 |
| 953.0 | 98.201 |
| 952.0 | 98.485 |
| 951.0 | 98.497 |
| 950.0 | 98.392 |
| 949.0 | 98.723 |
| 948.0 | 97.74 |
| 947.0 | 97.983 |
| 946.0 | 98.722 |
| 945.0 | 98.619 |
| 944.0 | 98.151 |
| 943.0 | 99.375 |
| 942.0 | 99.016 |
| 941.0 | 98.789 |
| 940.0 | 99.661 |
| 939.0 | 99.674 |
| 938.0 | 98.875 |
| 937.0 | 99.123 |
| 936.0 | 98.384 |
| 935.0 | 98.97 |
| 934.0 | 98.964 |
| 933.0 | 98.857 |
| 932.0 | 97.823 |
| 931.0 | 97.968 |
| 930.0 | 98.691 |
| 929.0 | 98.699 |
| 928.0 | 98.059 |
| 927.0 | 98.734 |
| 926.0 | 98.492 |
| 925.0 | 98.268 |
| 924.0 | 98.581 |
| 923.0 | 98.571 |
| 922.0 | 98.559 |
| 921.0 | 98.68 |
| 920.0 | 98.371 |
| 919.0 | 98.293 |
| 918.0 | 99.263 |
| 917.0 | 98.786 |
| 916.0 | 98.54 |
| 915.0 | 99.804 |
| 914.0 | 99.562 |
| 913.0 | 98.645 |
| 912.0 | 98.875 |
| 911.0 | 98.527 |
| 910.0 | 98.97 |
| 909.0 | 98.846 |
| 908.0 | 98.72 |
| 907.0 | 98.078 |
| 906.0 | 99.369 |
| 905.0 | 98.573 |
| 904.0 | 98.563 |
| 903.0 | 98.313 |
| 902.0 | 98.734 |
| 901.0 | 98.373 |
| 900.0 | 98.132 |
| 899.0 | 98.835 |
| 898.0 | 97.989 |
| 897.0 | 97.86 |
| 896.0 | 98.462 |
| 895.0 | 98.446 |
| 894.0 | 98.114 |
| 893.0 | 98.965 |
| 892.0 | 98.47 |
| 891.0 | 98.615 |
| 890.0 | 99.346 |
| 889.0 | 98.986 |
| 888.0 | 98.337 |
| 887.0 | 98.957 |
| 886.0 | 98.355 |
| 885.0 | 98.568 |
| 884.0 | 98.426 |
| 883.0 | 98.691 |
| 882.0 | 97.794 |
| 881.0 | 97.844 |
| 880.0 | 98.431 |
| 879.0 | 98.812 |
| 878.0 | 98.308 |
| 877.0 | 98.61 |
| 876.0 | 98.231 |
| 875.0 | 98.381 |
| 874.0 | 98.83 |
| 873.0 | 98.447 |
| 872.0 | 98.299 |
| 871.0 | 98.793 |
| 870.0 | 98.62 |
| 869.0 | 98.17 |
| 868.0 | 99.003 |
| 867.0 | 98.898 |
| 866.0 | 98.789 |
| 865.0 | 99.38 |
| 864.0 | 99.002 |
| 863.0 | 98.458 |
| 862.0 | 98.824 |
| 861.0 | 98.103 |
| 860.0 | 98.532 |
| 859.0 | 98.898 |
| 858.0 | 98.295 |
| 857.0 | 98.626 |
| 856.0 | 98.532 |
| 855.0 | 98.874 |
| 854.0 | 98.271 |
| 853.0 | 98.603 |
| 852.0 | 98.597 |
| 851.0 | 98.608 |
| 850.0 | 98.916 |
| 849.0 | 98.91 |
| 848.0 | 98.921 |
| 847.0 | 98.024 |
| 846.0 | 97.914 |
| 845.0 | 98.637 |
| 844.0 | 98.763 |
| 843.0 | 98.259 |
| 842.0 | 98.68 |
| 841.0 | 98.437 |
| 840.0 | 98.332 |
| 839.0 | 98.781 |
| 838.0 | 97.935 |
| 837.0 | 97.924 |
| 836.0 | 98.663 |
| 835.0 | 98.678 |
| 834.0 | 98.345 |
| 833.0 | 99.315 |
| 832.0 | 98.956 |
| 831.0 | 98.847 |
| 830.0 | 99.856 |
| 829.0 | 99.614 |
| 828.0 | 98.816 |
| 827.0 | 99.181 |
| 826.0 | 98.579 |
| 825.0 | 90.422 |
| 824.0 | 60.541 |
| 823.0 | 21.464 |
| 822.0 | 3.006 |
| 821.0 | 0.197 |
| 820.0 | 0.03 |
| 819.0 | 0.007 |
| 818.0 | 0.001 |
| 817.0 | 0 |
| 816.0 | 0 |
| 815.0 | 0 |
| 814.0 | 0 |
| 813.0 | 0 |
| 812.0 | 0 |
| 811.0 | 0 |
| 810.0 | 0 |
| 809.0 | 0 |
| 808.0 | 0 |
| 807.0 | 0 |
| 806.0 | 0 |
| 805.0 | 0 |
| 804.0 | 0 |
| 803.0 | 0 |
| 802.0 | 0 |
| 801.0 | 0 |
| 800.0 | 0.001 |
| 799.0 | 0.003 |
| 798.0 | 0.015 |
| 797.0 | 0.103 |
| 796.0 | 1.992 |
| 795.0 | 23.841 |
| 794.0 | 55.306 |
| 793.0 | 87.263 |
| 792.0 | 98.175 |
| 791.0 | 98.443 |
| 790.0 | 98.651 |
| 789.0 | 99.358 |
| 788.0 | 98.628 |
| 787.0 | 98.653 |
| 786.0 | 99.65 |
| 785.0 | 98.707 |
| 784.0 | 99.126 |
| 783.0 | 99.529 |
| 782.0 | 98.248 |
| 781.0 | 98.258 |
| 780.0 | 99.19 |
| 779.0 | 98.916 |
| 778.0 | 98.91 |
| 777.0 | 98.921 |
| 776.0 | 98.024 |
| 775.0 | 97.914 |
| 774.0 | 98.637 |
| 773.0 | 98.763 |
| 772.0 | 98.259 |
| 771.0 | 98.68 |
| 770.0 | 98.437 |
| 769.0 | 98.332 |
| 768.0 | 98.781 |
| 767.0 | 97.935 |
| 766.0 | 97.924 |
| 765.0 | 98.663 |
| 764.0 | 98.678 |
| 763.0 | 98.345 |
| 762.0 | 99.315 |
| 761.0 | 98.956 |
| 760.0 | 98.847 |
| 759.0 | 99.856 |
| 758.0 | 99.614 |
| 757.0 | 98.816 |
| 756.0 | 99.181 |
| 755.0 | 98.579 |
| 754.0 | 98.91 |
| 753.0 | 98.904 |
| 752.0 | 98.915 |
| 751.0 | 98.018 |
| 750.0 | 97.908 |
| 749.0 | 98.632 |
| 748.0 | 98.758 |
| 747.0 | 98.254 |
| 746.0 | 98.674 |
| 745.0 | 98.432 |
| 744.0 | 98.327 |
| 743.0 | 98.776 |
| 742.0 | 98.511 |
| 741.0 | 98.5 |
| 740.0 | 98.739 |
| 739.0 | 98.566 |
| 738.0 | 98.234 |
| 737.0 | 99.203 |
| 736.0 | 98.844 |
| 735.0 | 98.735 |
| 734.0 | 99.744 |
| 733.0 | 99.502 |
| 732.0 | 98.908 |
| 731.0 | 99.273 |
| 730.0 | 98.671 |
| 729.0 | 99.114 |
| 728.0 | 99.108 |
| 727.0 | 99.119 |
| 726.0 | 98.222 |
| 725.0 | 99.31 |
| 724.0 | 98.632 |
| 723.0 | 98.758 |
| 722.0 | 98.254 |
| 721.0 | 98.732 |
| 720.0 | 98.489 |
| 719.0 | 98.384 |
| 718.0 | 98.833 |
| 717.0 | 97.987 |
| 716.0 | 97.976 |
| 715.0 | 98.715 |
| 714.0 | 98.444 |
| 713.0 | 98.112 |
| 712.0 | 99.081 |
| 711.0 | 98.722 |
| 710.0 | 98.613 |
| 709.0 | 99.344 |
| 708.0 | 99.102 |
| 707.0 | 98.59 |
| 706.0 | 98.955 |
| 705.0 | 98.353 |
| 704.0 | 98.684 |
| 703.0 | 98.678 |
| 702.0 | 98.689 |
| 701.0 | 97.792 |
| 700.0 | 97.96 |
| 699.0 | 99.091 |
| 698.0 | 99.217 |
| 697.0 | 98.713 |
| 696.0 | 99.134 |
| 695.0 | 98.892 |
| 694.0 | 98.786 |
| 693.0 | 99.235 |
| 692.0 | 98.971 |
| 691.0 | 98.959 |
| 690.0 | 99.141 |
| 689.0 | 98.968 |
| 688.0 | 98.636 |
| 687.0 | 99.197 |
| 686.0 | 98.838 |
| 685.0 | 98.729 |
| 684.0 | 99.438 |
| 683.0 | 99.196 |
| 682.0 | 98.398 |
| 681.0 | 98.764 |
| 680.0 | 98.161 |
| 679.0 | 98.721 |
| 678.0 | 98.97 |
| 677.0 | 98.98 |
| 676.0 | 97.966 |
| 675.0 | 97.719 |
| 674.0 | 98.697 |
| 673.0 | 98.823 |
| 672.0 | 98.201 |
| 671.0 | 98.485 |
| 670.0 | 98.497 |
| 669.0 | 98.392 |
| 668.0 | 98.723 |
| 667.0 | 97.74 |
| 666.0 | 97.983 |
| 665.0 | 98.722 |
| 664.0 | 98.619 |
| 663.0 | 98.151 |
| 662.0 | 99.375 |
| 661.0 | 99.016 |
| 660.0 | 98.789 |
| 659.0 | 99.661 |
| 658.0 | 99.674 |
| 657.0 | 98.875 |
| 656.0 | 99.123 |
| 655.0 | 98.384 |
| 654.0 | 98.97 |
| 653.0 | 98.964 |
| 652.0 | 98.857 |
| 651.0 | 97.823 |
| 650.0 | 97.968 |
| 649.0 | 98.691 |
| 648.0 | 98.699 |
| 647.0 | 98.059 |
| 646.0 | 98.734 |
| 645.0 | 98.492 |
| 644.0 | 98.268 |
| 643.0 | 98.581 |
| 642.0 | 98.571 |
| 641.0 | 98.559 |
| 640.0 | 98.68 |
| 639.0 | 98.371 |
| 638.0 | 98.293 |
| 637.0 | 99.263 |
| 636.0 | 98.786 |
| 635.0 | 98.54 |
| 634.0 | 99.804 |
| 633.0 | 99.562 |
| 632.0 | 98.645 |
| 631.0 | 98.875 |
| 630.0 | 98.527 |
| 629.0 | 98.97 |
| 628.0 | 98.384 |
| 627.0 | 98.833 |
| 626.0 | 97.987 |
| 625.0 | 97.976 |
| 624.0 | 98.715 |
| 623.0 | 98.444 |
| 622.0 | 98.112 |
| 621.0 | 99.081 |
| 620.0 | 98.722 |
| 619.0 | 98.613 |
| 618.0 | 99.027 |
| 617.0 | 98.441 |
| 616.0 | 98.89 |
| 615.0 | 98.044 |
| 614.0 | 98.032 |
| 613.0 | 98.771 |
| 612.0 | 98.501 |
| 611.0 | 98.169 |
| 610.0 | 99.203 |
| 609.0 | 98.451 |
| 608.0 | 98.456 |
| 607.0 | 98.371 |
| 606.0 | 98.346 |
| 605.0 | 98.148 |
| 604.0 | 97.908 |
| 603.0 | 97.896 |
| 602.0 | 97.907 |
| 601.0 | 97.921 |
| 600.0 | 98.018 |
| 599.0 | 97.906 |
| 598.0 | 97.345 |
| 597.0 | 94.657 |
| 596.0 | 88.473 |
| 595.0 | 84.162 |
| 594.0 | 83.032 |
| 593.0 | 80.112 |
| 592.0 | 74.197 |
| 591.0 | 70.601 |
| 590.0 | 69.49 |
| 589.0 | 63.878 |
| 588.0 | 56.913 |
| 587.0 | 51.026 |
| 586.0 | 48.234 |
| 585.0 | 48.77 |
| 584.0 | 48.197 |
| 583.0 | 47.212 |
| 582.0 | 46.052 |
| 581.0 | 45.606 |
| 580.0 | 45.525 |
| 579.0 | 41.121 |
| 578.0 | 34.472 |
| 577.0 | 29.747 |
| 576.0 | 25.437 |
| 575.0 | 21.946 |
| 574.0 | 19.628 |
| 573.0 | 16.65 |
| 572.0 | 15.489 |
| 571.0 | 16.455 |
| 570.0 | 16.2 |
| 569.0 | 13.876 |
| 568.0 | 10.382 |
| 567.0 | 7.703 |
| 566.0 | 6.886 |
| 565.0 | 6.588 |
| 564.0 | 5.645 |
| 563.0 | 4.586 |
| 562.0 | 3.609 |
| 561.0 | 2.723 |
| 560.0 | 2.527 |
| 559.0 | 2.215 |
| 558.0 | 1.335 |
| 557.0 | 0.684 |
| 556.0 | 0.418 |
| 555.0 | 0.237 |
| 554.0 | 0.114 |
| 553.0 | 0.044 |
| 552.0 | 0.015 |
| 551.0 | 0.002 |
| 550.0 | 0.002 |
| 549.0 | 0.005 |
| 548.0 | 0.006 |
| 547.0 | 0.006 |
| 546.0 | 0.004 |
| 545.0 | 0.006 |
| 544.0 | 0.003 |
| 543.0 | 0.004 |
| 542.0 | 0.006 |
| 541.0 | 0.007 |
| 540.0 | 0.006 |
| 539.0 | 0.005 |
| 538.0 | 0.002 |
| 537.0 | 0.004 |
| 536.0 | 0.006 |
| 535.0 | 0.007 |
| 534.0 | 0.006 |
| 533.0 | 0.004 |
| 532.0 | 0.004 |
| 531.0 | 0.006 |
| 530.0 | 0.006 |
| 529.0 | 0.005 |
| 528.0 | 0.004 |
| 527.0 | 0.005 |
| 526.0 | 0.003 |
| 525.0 | 0.004 |
| 524.0 | 0.007 |
| 523.0 | 0.006 |
| 522.0 | 0.006 |
| 521.0 | 0.005 |
| 520.0 | 0.003 |
| 519.0 | 0.004 |
| 518.0 | 0.007 |
| 517.0 | 0.005 |
| 516.0 | 0.005 |
| 515.0 | 0.006 |
| 514.0 | 0.003 |
| 513.0 | 0.004 |
| 512.0 | 0.006 |
| 511.0 | 0.005 |
| 510.0 | 0.005 |
| 509.0 | 0.005 |
| 508.0 | 0.003 |
| 507.0 | 0.004 |
| 506.0 | 0.006 |
| 505.0 | 0.005 |
| 504.0 | 0.005 |
| 503.0 | 0.005 |
| 502.0 | 0.003 |
| 501.0 | 0.003 |
| 500.0 | 0.006 |
| 499.0 | 0.006 |
| 498.0 | 0.005 |
| 497.0 | 0.005 |
| 496.0 | 0.003 |
| 495.0 | 0.004 |
| 494.0 | 0.006 |
| 493.0 | 0.006 |
| 492.0 | 0.007 |
| 491.0 | 0.004 |
| 490.0 | 0.003 |
| 489.0 | 0.004 |
| 488.0 | 0.006 |
| 487.0 | 0.005 |
| 486.0 | 0.005 |
| 485.0 | 0.005 |
| 484.0 | 0.003 |
| 483.0 | 0.005 |
| 482.0 | 0.006 |
| 481.0 | 0.006 |
| 480.0 | 0.006 |
| 479.0 | 0.005 |
| 478.0 | 0.003 |
| 477.0 | 0.005 |
| 476.0 | 0.006 |
| 475.0 | 0.005 |
| 474.0 | 0.005 |
| 473.0 | 0.004 |
| 472.0 | 0.003 |
| 471.0 | 0.005 |
| 470.0 | 0.007 |
| 469.0 | 0.006 |
| 468.0 | 0.006 |
| 467.0 | 0.005 |
| 466.0 | 0.003 |
| 465.0 | 0.005 |
| 464.0 | 0.007 |
| 463.0 | 0.007 |
| 462.0 | 0.006 |
| 461.0 | 0.004 |
| 460.0 | 0.003 |
| 459.0 | 0.004 |
| 458.0 | 0.005 |
| 457.0 | 0.006 |
| 456.0 | 0.007 |
| 455.0 | 0.005 |
| 454.0 | 0.002 |
| 453.0 | 0.004 |
| 452.0 | 0.006 |
| 451.0 | 0.006 |
| 450.0 | 0.007 |
| 449.0 | 0.004 |
| 448.0 | 0.002 |
| 447.0 | 0.004 |
| 446.0 | 0.006 |
| 445.0 | 0.007 |
| 444.0 | 0.006 |
| 443.0 | 0.003 |
| 442.0 | 0.002 |
| 441.0 | 0.004 |
| 440.0 | 0.006 |
| 439.0 | 0.006 |
| 438.0 | 0.005 |
| 437.0 | 0.004 |
| 436.0 | 0.003 |
| 435.0 | 0.005 |
| 434.0 | 0.007 |
| 433.0 | 0.005 |
| 432.0 | 0.005 |
| 431.0 | 0.005 |
| 430.0 | 0.003 |
| 429.0 | 0.005 |
| 428.0 | 0.006 |
| 427.0 | 0.005 |
| 426.0 | 0.005 |
| 425.0 | 0.004 |
| 424.0 | 0.002 |
| 423.0 | 0.005 |
| 422.0 | 0.006 |
| 421.0 | 0.003 |
| 420.0 | 0.004 |
| 419.0 | 0.004 |
| 418.0 | 0.001 |
| 417.0 | 0.006 |
| 416.0 | 0.008 |
| 415.0 | 0.006 |
| 414.0 | 0.005 |
| 413.0 | 0.004 |
| 412.0 | 0.002 |
| 411.0 | 0.005 |
| 410.0 | 0.007 |
| 409.0 | 0.007 |
| 408.0 | 0.006 |
| 407.0 | 0.005 |
| 406.0 | 0.003 |
| 405.0 | 0.005 |
| 404.0 | 0.005 |
| 403.0 | 0.004 |
| 402.0 | 0.005 |
| 401.0 | 0.004 |
| 400.0 | 0.001 |
| 399.0 | 0.001 |
| 398.0 | 0.004 |
| 397.0 | 0.028 |
| 396.0 | 0.051 |
| 395.0 | 0.129 |
| 394.0 | 0.558 |
| 393.0 | 1.577 |
| 392.0 | 2.294 |
| 391.0 | 1.709 |
| 390.0 | 0.904 |
| 389.0 | 0.719 |
| 388.0 | 0.55 |
| 387.0 | 0.275 |
| 386.0 | 0.17 |
| 385.0 | 0.164 |
| 384.0 | 0.108 |
| 383.0 | 0.177 |
| 382.0 | 0.524 |
| 381.0 | 0.807 |
| 380.0 | 1.233 |
| 379.0 | 1.726 |
| 378.0 | 1.341 |
| 377.0 | 0.667 |
| 376.0 | 0.43 |
| 375.0 | 0.459 |
| 374.0 | 0.912 |
| 373.0 | 2.383 |
| 372.0 | 4.387 |
| 371.0 | 5.55 |
| 370.0 | 4.908 |
| 369.0 | 2.988 |
| 368.0 | 1.316 |
| 367.0 | 0.603 |
| 366.0 | 0.41 |
| 365.0 | 0.492 |
| 364.0 | 0.665 |
| 363.0 | 0.612 |
| 362.0 | 0.341 |
| 361.0 | 0.13 |
| 360.0 | 0.063 |
| 359.0 | 0.042 |
| 358.0 | 0.015 |
| 357.0 | 0 |
| 356.0 | 0.006 |
| 355.0 | 0.002 |
| 354.0 | 0.002 |
| 353.0 | 0.004 |
| 352.0 | 0.006 |
| 351.0 | 0.006 |
| 350.0 | 0.007 |
| 349.0 | 0.002 |
| 348.0 | 0.001 |
| 347.0 | 0.006 |
| 346.0 | 0.007 |
| 345.0 | 0.004 |
| 344.0 | 0.006 |
| 343.0 | 0.001 |
| 342.0 | 0.002 |
| 341.0 | 0.004 |
| 340.0 | 0.007 |
| 339.0 | 0.006 |
| 338.0 | 0.006 |
| 337.0 | 0.002 |
| 336.0 | 0.002 |
| 335.0 | 0.006 |
| 334.0 | 0.006 |
| 333.0 | 0.006 |
| 332.0 | 0.006 |
| 331.0 | 0.002 |
| 330.0 | 0.003 |
| 329.0 | 0.005 |
| 328.0 | 0.007 |
| 327.0 | 0.006 |
| 326.0 | 0.005 |
| 325.0 | 0.002 |
| 324.0 | 0.001 |
| 323.0 | 0.006 |
| 322.0 | 0.006 |
| 321.0 | 0.007 |
| 320.0 | 0.006 |
| 319.0 | 0.002 |
| 318.0 | 0.005 |
| 317.0 | 0.005 |
| 316.0 | 0.004 |
| 315.0 | 0.002 |
| 314.0 | 0.005 |
| 313.0 | 0.001 |
| 312.0 | 0.002 |
| 311.0 | 0.005 |
| 310.0 | 0.006 |
| 309.0 | 0.003 |
| 308.0 | 0.006 |
| 307.0 | 0.001 |
| 306.0 | 0.005 |
| 305.0 | 0.005 |
| 304.0 | 0.006 |
| 303.0 | 0.002 |
| 302.0 | 0.006 |
| 301.0 | 0.001 |
| 300.0 | 0.002 |
| 299.0 | 0.004 |
| 298.0 | 0.007 |
| 297.0 | 0.003 |
| 296.0 | 0.006 |
| 295.0 | 0.001 |
| 294.0 | 0.001 |
| 293.0 | 0.004 |
| 292.0 | 0.007 |
| 291.0 | 0.002 |
| 290.0 | 0.006 |
| 289.0 | 0.001 |
| 288.0 | 0.002 |
| 287.0 | 0.005 |
| 286.0 | 0.007 |
| 285.0 | 0.001 |
| 284.0 | 0.005 |
| 283.0 | 0.002 |
| 282.0 | 0.002 |
| 281.0 | 0.004 |
| 280.0 | 0.006 |
| 279.0 | 0.006 |
| 278.0 | 0.006 |
| 277.0 | 0.004 |
| 276.0 | 0.004 |
| 275.0 | 0.005 |
| 274.0 | 0.007 |
| 273.0 | 0.006 |
| 272.0 | 0.005 |
| 271.0 | 0.005 |
| 270.0 | 0.005 |
| 269.0 | 0.006 |
| 268.0 | 0.003 |
| 267.0 | 0.001 |
| 266.0 | 0.001 |
| 265.0 | 0.001 |
| 264.0 | 0.001 |
| 263.0 | 0.001 |
| 262.0 | 0.007 |
| 261.0 | 0.007 |
| 260.0 | 0.002 |
| 259.0 | 0.007 |
| 258.0 | 0.001 |
| 257.0 | 0.004 |
| 256.0 | 0.004 |
| 255.0 | 0.008 |
| 254.0 | 0.001 |
| 253.0 | 0.007 |
| 252.0 | 0.001 |
| 251.0 | 0.002 |
| 250.0 | 0.007 |
| 249.0 | 0.007 |
| 248.0 | 0.002 |
| 247.0 | 0.007 |
| 246.0 | 0 |
| 245.0 | 0.003 |
| 244.0 | 0.005 |
| 243.0 | 0.007 |
| 242.0 | 0.005 |
| 241.0 | 0.006 |
| 240.0 | 0.001 |
| 239.0 | 0.004 |
| 238.0 | 0.007 |
| 237.0 | 0.008 |
| 236.0 | 0.002 |
| 235.0 | 0.007 |
| 234.0 | 0.001 |
| 233.0 | 0.003 |
| 232.0 | 0.007 |
| 231.0 | 0.007 |
| 230.0 | 0.005 |
| 229.0 | 0.006 |
| 228.0 | 0.002 |
| 227.0 | 0.003 |
| 226.0 | 0.007 |
| 225.0 | 0.007 |
| 224.0 | 0.007 |
| 223.0 | 0.007 |
| 222.0 | 0.003 |
| 221.0 | 0.002 |
| 220.0 | 0.008 |
| 219.0 | 0.006 |
| 218.0 | 0.005 |
| 217.0 | 0.007 |
| 216.0 | 0.003 |
| 215.0 | 0.003 |
| 214.0 | 0.008 |
| 213.0 | 0.007 |
| 212.0 | 0.005 |
| 211.0 | 0.006 |
| 210.0 | 0.003 |
| 209.0 | 0.002 |
| 208.0 | 0.008 |
| 207.0 | 0.008 |
| 206.0 | 0.006 |
| 205.0 | 0.007 |
| 204.0 | 0.005 |
| 203.0 | 0.005 |
| 202.0 | 0.011 |
| 201.0 | 0.01 |